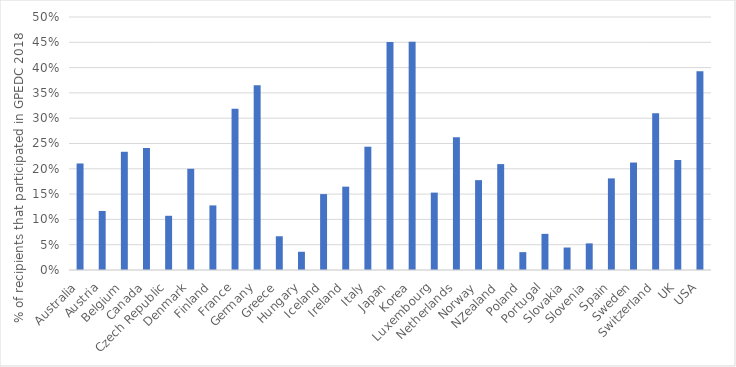
| Category | Series 0 |
|---|---|
| Australia | 0.211 |
| Austria | 0.117 |
| Belgium | 0.234 |
| Canada | 0.241 |
| Czech Republic | 0.107 |
| Denmark | 0.2 |
| Finland | 0.128 |
| France | 0.319 |
| Germany | 0.365 |
| Greece | 0.067 |
| Hungary | 0.036 |
| Iceland | 0.15 |
| Ireland | 0.165 |
| Italy | 0.244 |
| Japan | 0.451 |
| Korea | 0.451 |
| Luxembourg | 0.153 |
| Netherlands | 0.262 |
| Norway | 0.178 |
| NZealand | 0.209 |
| Poland | 0.035 |
| Portugal | 0.071 |
| Slovakia | 0.044 |
| Slovenia | 0.053 |
| Spain | 0.181 |
| Sweden | 0.212 |
| Switzerland | 0.31 |
| UK | 0.217 |
| USA | 0.393 |